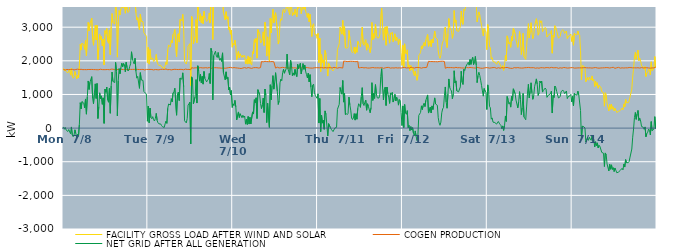
| Category | FACILITY GROSS LOAD AFTER WIND AND SOLAR | COGEN PRODUCTION | NET GRID AFTER ALL GENERATION |
|---|---|---|---|
|  Mon  7/8 | 1779 | 1744 | 35 |
|  Mon  7/8 | 1704 | 1739 | -35 |
|  Mon  7/8 | 1746 | 1725 | 21 |
|  Mon  7/8 | 1680 | 1735 | -55 |
|  Mon  7/8 | 1701 | 1744 | -43 |
|  Mon  7/8 | 1641 | 1742 | -101 |
|  Mon  7/8 | 1695 | 1737 | -42 |
|  Mon  7/8 | 1744 | 1760 | -16 |
|  Mon  7/8 | 1575 | 1742 | -167 |
|  Mon  7/8 | 1783 | 1749 | 34 |
|  Mon  7/8 | 1544 | 1747 | -203 |
|  Mon  7/8 | 1484 | 1739 | -255 |
|  Mon  7/8 | 1523 | 1730 | -207 |
|  Mon  7/8 | 1684 | 1734 | -50 |
|  Mon  7/8 | 1579 | 1742 | -163 |
|  Mon  7/8 | 1465 | 1742 | -277 |
|  Mon  7/8 | 1567 | 1752 | -185 |
|  Mon  7/8 | 1490 | 1734 | -244 |
|  Mon  7/8 | 1843 | 1742 | 101 |
|  Mon  7/8 | 2488 | 1733 | 755 |
|  Mon  7/8 | 2319 | 1748 | 571 |
|  Mon  7/8 | 2528 | 1740 | 788 |
|  Mon  7/8 | 2536 | 1737 | 799 |
|  Mon  7/8 | 2483 | 1741 | 742 |
|  Mon  7/8 | 2338 | 1739 | 599 |
|  Mon  7/8 | 2602 | 1736 | 866 |
|  Mon  7/8 | 2151 | 1737 | 414 |
|  Mon  7/8 | 2676 | 1745 | 931 |
|  Mon  7/8 | 3143 | 1742 | 1401 |
|  Mon  7/8 | 2890 | 1742 | 1148 |
|  Mon  7/8 | 3107 | 1742 | 1365 |
|  Mon  7/8 | 3119 | 1745 | 1374 |
|  Mon  7/8 | 3273 | 1744 | 1529 |
|  Mon  7/8 | 2642 | 1749 | 893 |
|  Mon  7/8 | 2463 | 1740 | 723 |
|  Mon  7/8 | 2777 | 1738 | 1039 |
|  Mon  7/8 | 3053 | 1738 | 1315 |
|  Mon  7/8 | 2619 | 1738 | 881 |
|  Mon  7/8 | 3061 | 1734 | 1327 |
|  Mon  7/8 | 2040 | 1754 | 286 |
|  Mon  7/8 | 2371 | 1735 | 636 |
|  Mon  7/8 | 2790 | 1741 | 1049 |
|  Mon  7/8 | 2626 | 1750 | 876 |
|  Mon  7/8 | 2720 | 1763 | 957 |
|  Mon  7/8 | 2446 | 1739 | 707 |
|  Mon  7/8 | 2644 | 1746 | 898 |
|  Mon  7/8 | 1877 | 1737 | 140 |
|  Mon  7/8 | 2898 | 1738 | 1160 |
|  Mon  7/8 | 2804 | 1738 | 1066 |
|  Mon  7/8 | 2962 | 1743 | 1219 |
|  Mon  7/8 | 2581 | 1741 | 840 |
|  Mon  7/8 | 2522 | 1753 | 769 |
|  Mon  7/8 | 2916 | 1735 | 1181 |
|  Mon  7/8 | 2185 | 1744 | 441 |
|  Mon  7/8 | 3006 | 1752 | 1254 |
|  Mon  7/8 | 3406 | 1740 | 1666 |
|  Mon  7/8 | 3139 | 1751 | 1388 |
|  Mon  7/8 | 3151 | 1747 | 1404 |
|  Mon  7/8 | 3092 | 1739 | 1353 |
|  Mon  7/8 | 3686 | 1733 | 1953 |
|  Mon  7/8 | 3431 | 1744 | 1687 |
|  Mon  7/8 | 2109 | 1746 | 363 |
|  Mon  7/8 | 3145 | 1739 | 1406 |
|  Mon  7/8 | 3496 | 1727 | 1769 |
|  Mon  7/8 | 3362 | 1745 | 1617 |
|  Mon  7/8 | 3542 | 1744 | 1798 |
|  Mon  7/8 | 3671 | 1743 | 1928 |
|  Mon  7/8 | 3567 | 1742 | 1825 |
|  Mon  7/8 | 3660 | 1739 | 1921 |
|  Mon  7/8 | 3629 | 1741 | 1888 |
|  Mon  7/8 | 3415 | 1742 | 1673 |
|  Mon  7/8 | 3703 | 1746 | 1957 |
|  Mon  7/8 | 3536 | 1738 | 1798 |
|  Mon  7/8 | 3436 | 1739 | 1697 |
|  Mon  7/8 | 3467 | 1740 | 1727 |
|  Mon  7/8 | 3587 | 1751 | 1836 |
|  Mon  7/8 | 3656 | 1745 | 1911 |
|  Mon  7/8 | 4012 | 1743 | 2269 |
|  Mon  7/8 | 3803 | 1745 | 2058 |
|  Mon  7/8 | 3716 | 1739 | 1977 |
|  Mon  7/8 | 3655 | 1746 | 1909 |
|  Mon  7/8 | 3821 | 1744 | 2077 |
|  Mon  7/8 | 3432 | 1744 | 1688 |
|  Mon  7/8 | 3213 | 1729 | 1484 |
|  Mon  7/8 | 3283 | 1745 | 1538 |
|  Mon  7/8 | 3303 | 1737 | 1566 |
|  Mon  7/8 | 2923 | 1741 | 1182 |
|  Mon  7/8 | 3392 | 1744 | 1648 |
|  Mon  7/8 | 3176 | 1744 | 1432 |
|  Mon  7/8 | 3180 | 1748 | 1432 |
|  Mon  7/8 | 3164 | 1745 | 1419 |
|  Mon  7/8 | 2836 | 1748 | 1088 |
|  Mon  7/8 | 2798 | 1728 | 1070 |
|  Mon  7/8 | 2778 | 1743 | 1035 |
|  Mon  7/8 | 2730 | 1745 | 985 |
|  Mon  7/8 | 1947 | 1743 | 204 |
|  Tue  7/9 | 2399 | 1743 | 656 |
|  Tue  7/9 | 1902 | 1744 | 158 |
|  Tue  7/9 | 2338 | 1744 | 594 |
|  Tue  7/9 | 2044 | 1736 | 308 |
|  Tue  7/9 | 2019 | 1742 | 277 |
|  Tue  7/9 | 2079 | 1739 | 340 |
|  Tue  7/9 | 1978 | 1729 | 249 |
|  Tue  7/9 | 1954 | 1743 | 211 |
|  Tue  7/9 | 2030 | 1741 | 289 |
|  Tue  7/9 | 2190 | 1753 | 437 |
|  Tue  7/9 | 1962 | 1736 | 226 |
|  Tue  7/9 | 1895 | 1738 | 157 |
|  Tue  7/9 | 1859 | 1732 | 127 |
|  Tue  7/9 | 1866 | 1742 | 124 |
|  Tue  7/9 | 1869 | 1746 | 123 |
|  Tue  7/9 | 1814 | 1740 | 74 |
|  Tue  7/9 | 1791 | 1749 | 42 |
|  Tue  7/9 | 1794 | 1739 | 55 |
|  Tue  7/9 | 1761 | 1743 | 18 |
|  Tue  7/9 | 1861 | 1737 | 124 |
|  Tue  7/9 | 1967 | 1757 | 210 |
|  Tue  7/9 | 1892 | 1753 | 139 |
|  Tue  7/9 | 2324 | 1735 | 589 |
|  Tue  7/9 | 2473 | 1756 | 717 |
|  Tue  7/9 | 2473 | 1741 | 732 |
|  Tue  7/9 | 2409 | 1723 | 686 |
|  Tue  7/9 | 2606 | 1730 | 876 |
|  Tue  7/9 | 2529 | 1746 | 783 |
|  Tue  7/9 | 2784 | 1741 | 1043 |
|  Tue  7/9 | 2823 | 1742 | 1081 |
|  Tue  7/9 | 2932 | 1748 | 1184 |
|  Tue  7/9 | 2910 | 1739 | 1171 |
|  Tue  7/9 | 2126 | 1743 | 383 |
|  Tue  7/9 | 2759 | 1748 | 1011 |
|  Tue  7/9 | 2812 | 1740 | 1072 |
|  Tue  7/9 | 2558 | 1739 | 819 |
|  Tue  7/9 | 3235 | 1746 | 1489 |
|  Tue  7/9 | 3255 | 1738 | 1517 |
|  Tue  7/9 | 3196 | 1743 | 1453 |
|  Tue  7/9 | 3382 | 1739 | 1643 |
|  Tue  7/9 | 2959 | 1733 | 1226 |
|  Tue  7/9 | 1974 | 1756 | 218 |
|  Tue  7/9 | 1994 | 1754 | 240 |
|  Tue  7/9 | 1904 | 1749 | 155 |
|  Tue  7/9 | 2025 | 1743 | 282 |
|  Tue  7/9 | 2434 | 1749 | 685 |
|  Tue  7/9 | 2466 | 1745 | 721 |
|  Tue  7/9 | 2511 | 1740 | 771 |
|  Tue  7/9 | 1263 | 1734 | -471 |
|  Tue  7/9 | 3320 | 1797 | 1523 |
|  Tue  7/9 | 3258 | 1793 | 1465 |
|  Tue  7/9 | 2503 | 1784 | 719 |
|  Tue  7/9 | 2497 | 1802 | 695 |
|  Tue  7/9 | 2727 | 1792 | 935 |
|  Tue  7/9 | 3228 | 1787 | 1441 |
|  Tue  7/9 | 2537 | 1792 | 745 |
|  Tue  7/9 | 3656 | 1803 | 1853 |
|  Tue  7/9 | 3480 | 1786 | 1694 |
|  Tue  7/9 | 3186 | 1791 | 1395 |
|  Tue  7/9 | 3398 | 1798 | 1600 |
|  Tue  7/9 | 3131 | 1784 | 1347 |
|  Tue  7/9 | 3328 | 1790 | 1538 |
|  Tue  7/9 | 3103 | 1796 | 1307 |
|  Tue  7/9 | 3473 | 1789 | 1684 |
|  Tue  7/9 | 3277 | 1805 | 1472 |
|  Tue  7/9 | 3284 | 1796 | 1488 |
|  Tue  7/9 | 3171 | 1797 | 1374 |
|  Tue  7/9 | 3210 | 1787 | 1423 |
|  Tue  7/9 | 3246 | 1791 | 1455 |
|  Tue  7/9 | 3423 | 1800 | 1623 |
|  Tue  7/9 | 3122 | 1798 | 1324 |
|  Tue  7/9 | 4143 | 1773 | 2370 |
|  Tue  7/9 | 4055 | 1800 | 2255 |
|  Tue  7/9 | 2632 | 1794 | 838 |
|  Tue  7/9 | 3956 | 1801 | 2155 |
|  Tue  7/9 | 3959 | 1795 | 2164 |
|  Tue  7/9 | 4084 | 1798 | 2286 |
|  Tue  7/9 | 3931 | 1794 | 2137 |
|  Tue  7/9 | 3903 | 1804 | 2099 |
|  Tue  7/9 | 4037 | 1789 | 2248 |
|  Tue  7/9 | 3873 | 1783 | 2090 |
|  Tue  7/9 | 3801 | 1787 | 2014 |
|  Tue  7/9 | 3883 | 1809 | 2074 |
|  Tue  7/9 | 3760 | 1781 | 1979 |
|  Tue  7/9 | 4023 | 1786 | 2237 |
|  Tue  7/9 | 3431 | 1785 | 1646 |
|  Tue  7/9 | 3426 | 1799 | 1627 |
|  Tue  7/9 | 3215 | 1780 | 1435 |
|  Tue  7/9 | 3461 | 1788 | 1673 |
|  Tue  7/9 | 3244 | 1787 | 1457 |
|  Tue  7/9 | 3310 | 1799 | 1511 |
|  Tue  7/9 | 2934 | 1798 | 1136 |
|  Tue  7/9 | 3007 | 1798 | 1209 |
|  Tue  7/9 | 2791 | 1805 | 986 |
|  Tue  7/9 | 2915 | 1801 | 1114 |
|  Tue  7/9 | 2405 | 1790 | 615 |
|  Wed  7/10 | 2515 | 1795 | 720 |
|  Wed  7/10 | 2470 | 1799 | 671 |
|  Wed  7/10 | 2615 | 1790 | 825 |
|  Wed  7/10 | 2422 | 1791 | 631 |
|  Wed  7/10 | 2036 | 1794 | 242 |
|  Wed  7/10 | 2047 | 1786 | 261 |
|  Wed  7/10 | 2283 | 1803 | 480 |
|  Wed  7/10 | 2093 | 1779 | 314 |
|  Wed  7/10 | 2207 | 1781 | 426 |
|  Wed  7/10 | 2190 | 1772 | 418 |
|  Wed  7/10 | 2096 | 1789 | 307 |
|  Wed  7/10 | 2169 | 1786 | 383 |
|  Wed  7/10 | 2115 | 1796 | 319 |
|  Wed  7/10 | 2158 | 1799 | 359 |
|  Wed  7/10 | 1917 | 1800 | 117 |
|  Wed  7/10 | 2043 | 1781 | 262 |
|  Wed  7/10 | 1902 | 1795 | 107 |
|  Wed  7/10 | 2145 | 1800 | 345 |
|  Wed  7/10 | 1914 | 1794 | 120 |
|  Wed  7/10 | 2108 | 1787 | 321 |
|  Wed  7/10 | 1910 | 1787 | 123 |
|  Wed  7/10 | 1873 | 1776 | 97 |
|  Wed  7/10 | 2271 | 1789 | 482 |
|  Wed  7/10 | 2212 | 1795 | 417 |
|  Wed  7/10 | 2633 | 1789 | 844 |
|  Wed  7/10 | 2552 | 1798 | 754 |
|  Wed  7/10 | 2675 | 1774 | 901 |
|  Wed  7/10 | 2080 | 1796 | 284 |
|  Wed  7/10 | 2929 | 1787 | 1142 |
|  Wed  7/10 | 2918 | 1784 | 1134 |
|  Wed  7/10 | 2788 | 1797 | 991 |
|  Wed  7/10 | 2528 | 1799 | 729 |
|  Wed  7/10 | 2558 | 1979 | 579 |
|  Wed  7/10 | 2664 | 1977 | 687 |
|  Wed  7/10 | 2861 | 1969 | 892 |
|  Wed  7/10 | 2455 | 1992 | 463 |
|  Wed  7/10 | 3148 | 1986 | 1162 |
|  Wed  7/10 | 2963 | 1982 | 981 |
|  Wed  7/10 | 2140 | 1977 | 163 |
|  Wed  7/10 | 2712 | 1974 | 738 |
|  Wed  7/10 | 2728 | 1975 | 753 |
|  Wed  7/10 | 2004 | 1983 | 21 |
|  Wed  7/10 | 3264 | 1975 | 1289 |
|  Wed  7/10 | 2830 | 1987 | 843 |
|  Wed  7/10 | 3243 | 1978 | 1265 |
|  Wed  7/10 | 3534 | 1974 | 1560 |
|  Wed  7/10 | 3130 | 1972 | 1158 |
|  Wed  7/10 | 3332 | 1973 | 1359 |
|  Wed  7/10 | 3430 | 1783 | 1647 |
|  Wed  7/10 | 3448 | 1809 | 1639 |
|  Wed  7/10 | 2895 | 1810 | 1085 |
|  Wed  7/10 | 2498 | 1795 | 703 |
|  Wed  7/10 | 2599 | 1788 | 811 |
|  Wed  7/10 | 3137 | 1792 | 1345 |
|  Wed  7/10 | 3251 | 1794 | 1457 |
|  Wed  7/10 | 3206 | 1799 | 1407 |
|  Wed  7/10 | 3462 | 1806 | 1656 |
|  Wed  7/10 | 3536 | 1789 | 1747 |
|  Wed  7/10 | 3425 | 1795 | 1630 |
|  Wed  7/10 | 3404 | 1788 | 1616 |
|  Wed  7/10 | 3564 | 1795 | 1769 |
|  Wed  7/10 | 3991 | 1792 | 2199 |
|  Wed  7/10 | 3547 | 1784 | 1763 |
|  Wed  7/10 | 3457 | 1787 | 1670 |
|  Wed  7/10 | 3369 | 1785 | 1584 |
|  Wed  7/10 | 3807 | 1793 | 2014 |
|  Wed  7/10 | 3657 | 1798 | 1859 |
|  Wed  7/10 | 3343 | 1785 | 1558 |
|  Wed  7/10 | 3431 | 1790 | 1641 |
|  Wed  7/10 | 3366 | 1796 | 1570 |
|  Wed  7/10 | 3537 | 1792 | 1745 |
|  Wed  7/10 | 3404 | 1802 | 1602 |
|  Wed  7/10 | 3310 | 1781 | 1529 |
|  Wed  7/10 | 3697 | 1803 | 1894 |
|  Wed  7/10 | 3561 | 1794 | 1767 |
|  Wed  7/10 | 3659 | 1793 | 1866 |
|  Wed  7/10 | 3712 | 1785 | 1927 |
|  Wed  7/10 | 3403 | 1793 | 1610 |
|  Wed  7/10 | 3557 | 1790 | 1767 |
|  Wed  7/10 | 3699 | 1782 | 1917 |
|  Wed  7/10 | 3534 | 1786 | 1748 |
|  Wed  7/10 | 3677 | 1807 | 1870 |
|  Wed  7/10 | 3486 | 1799 | 1687 |
|  Wed  7/10 | 3374 | 1786 | 1588 |
|  Wed  7/10 | 3288 | 1798 | 1490 |
|  Wed  7/10 | 3413 | 1781 | 1632 |
|  Wed  7/10 | 3162 | 1788 | 1374 |
|  Wed  7/10 | 3383 | 1794 | 1589 |
|  Wed  7/10 | 2996 | 1784 | 1212 |
|  Wed  7/10 | 2722 | 1790 | 932 |
|  Wed  7/10 | 3056 | 1783 | 1273 |
|  Wed  7/10 | 3104 | 1797 | 1307 |
|  Wed  7/10 | 2842 | 1794 | 1048 |
|  Wed  7/10 | 2762 | 1793 | 969 |
|  Wed  7/10 | 2792 | 1796 | 996 |
|  Wed  7/10 | 2668 | 1784 | 884 |
|  Thu  7/11 | 2814 | 1795 | 1019 |
|  Thu  7/11 | 1948 | 1798 | 150 |
|  Thu  7/11 | 2674 | 1793 | 881 |
|  Thu  7/11 | 1680 | 1786 | -106 |
|  Thu  7/11 | 2182 | 1799 | 383 |
|  Thu  7/11 | 1950 | 1802 | 148 |
|  Thu  7/11 | 2027 | 1789 | 238 |
|  Thu  7/11 | 1761 | 1797 | -36 |
|  Thu  7/11 | 2308 | 1797 | 511 |
|  Thu  7/11 | 2204 | 1797 | 407 |
|  Thu  7/11 | 2177 | 1789 | 388 |
|  Thu  7/11 | 1547 | 1783 | -236 |
|  Thu  7/11 | 1926 | 1794 | 132 |
|  Thu  7/11 | 1942 | 1793 | 149 |
|  Thu  7/11 | 1808 | 1796 | 12 |
|  Thu  7/11 | 1752 | 1788 | -36 |
|  Thu  7/11 | 1735 | 1787 | -52 |
|  Thu  7/11 | 1700 | 1805 | -105 |
|  Thu  7/11 | 1719 | 1806 | -87 |
|  Thu  7/11 | 1793 | 1794 | -1 |
|  Thu  7/11 | 1818 | 1796 | 22 |
|  Thu  7/11 | 1815 | 1792 | 23 |
|  Thu  7/11 | 2342 | 1782 | 560 |
|  Thu  7/11 | 2352 | 1794 | 558 |
|  Thu  7/11 | 2505 | 1799 | 706 |
|  Thu  7/11 | 3000 | 1794 | 1206 |
|  Thu  7/11 | 2881 | 1795 | 1086 |
|  Thu  7/11 | 2792 | 1786 | 1006 |
|  Thu  7/11 | 3199 | 1785 | 1414 |
|  Thu  7/11 | 2762 | 1990 | 772 |
|  Thu  7/11 | 3015 | 1986 | 1029 |
|  Thu  7/11 | 2387 | 1986 | 401 |
|  Thu  7/11 | 2407 | 1976 | 431 |
|  Thu  7/11 | 2377 | 1977 | 400 |
|  Thu  7/11 | 2410 | 1972 | 438 |
|  Thu  7/11 | 2902 | 1981 | 921 |
|  Thu  7/11 | 2669 | 1977 | 692 |
|  Thu  7/11 | 2519 | 1986 | 533 |
|  Thu  7/11 | 2277 | 1977 | 300 |
|  Thu  7/11 | 2239 | 1983 | 256 |
|  Thu  7/11 | 2280 | 1979 | 301 |
|  Thu  7/11 | 2410 | 1979 | 431 |
|  Thu  7/11 | 2218 | 1981 | 237 |
|  Thu  7/11 | 2400 | 1973 | 427 |
|  Thu  7/11 | 2254 | 1990 | 264 |
|  Thu  7/11 | 2577 | 1986 | 591 |
|  Thu  7/11 | 2510 | 1786 | 724 |
|  Thu  7/11 | 2461 | 1783 | 678 |
|  Thu  7/11 | 2415 | 1798 | 617 |
|  Thu  7/11 | 2727 | 1791 | 936 |
|  Thu  7/11 | 3004 | 1802 | 1202 |
|  Thu  7/11 | 2510 | 1788 | 722 |
|  Thu  7/11 | 2460 | 1790 | 670 |
|  Thu  7/11 | 2558 | 1790 | 768 |
|  Thu  7/11 | 2629 | 1796 | 833 |
|  Thu  7/11 | 2317 | 1786 | 531 |
|  Thu  7/11 | 2509 | 1786 | 723 |
|  Thu  7/11 | 2439 | 1797 | 642 |
|  Thu  7/11 | 2445 | 1785 | 660 |
|  Thu  7/11 | 2242 | 1786 | 456 |
|  Thu  7/11 | 2402 | 1792 | 610 |
|  Thu  7/11 | 3142 | 1792 | 1350 |
|  Thu  7/11 | 2624 | 1801 | 823 |
|  Thu  7/11 | 2807 | 1773 | 1034 |
|  Thu  7/11 | 2674 | 1791 | 883 |
|  Thu  7/11 | 3086 | 1794 | 1292 |
|  Thu  7/11 | 2813 | 1791 | 1022 |
|  Thu  7/11 | 2683 | 1785 | 898 |
|  Thu  7/11 | 2697 | 1792 | 905 |
|  Thu  7/11 | 2686 | 1792 | 894 |
|  Thu  7/11 | 2796 | 1787 | 1009 |
|  Thu  7/11 | 3329 | 1794 | 1535 |
|  Thu  7/11 | 3566 | 1800 | 1766 |
|  Thu  7/11 | 3021 | 1799 | 1222 |
|  Thu  7/11 | 2615 | 1776 | 839 |
|  Thu  7/11 | 2929 | 1780 | 1149 |
|  Thu  7/11 | 3010 | 1791 | 1219 |
|  Thu  7/11 | 2462 | 1791 | 671 |
|  Thu  7/11 | 3022 | 1802 | 1220 |
|  Thu  7/11 | 2817 | 1797 | 1020 |
|  Thu  7/11 | 2725 | 1803 | 922 |
|  Thu  7/11 | 2526 | 1792 | 734 |
|  Thu  7/11 | 2829 | 1783 | 1046 |
|  Thu  7/11 | 2792 | 1794 | 998 |
|  Thu  7/11 | 2851 | 1791 | 1060 |
|  Thu  7/11 | 2570 | 1796 | 774 |
|  Thu  7/11 | 2640 | 1786 | 854 |
|  Thu  7/11 | 2803 | 1798 | 1005 |
|  Thu  7/11 | 2601 | 1795 | 806 |
|  Thu  7/11 | 2706 | 1790 | 916 |
|  Thu  7/11 | 2664 | 1787 | 877 |
|  Thu  7/11 | 2479 | 1797 | 682 |
|  Thu  7/11 | 2640 | 1791 | 849 |
|  Thu  7/11 | 2610 | 1796 | 814 |
|  Thu  7/11 | 2250 | 1785 | 465 |
|  Thu  7/11 | 1864 | 1789 | 75 |
|  Fri  7/12 | 2457 | 1798 | 659 |
|  Fri  7/12 | 1803 | 1788 | 15 |
|  Fri  7/12 | 2505 | 1803 | 702 |
|  Fri  7/12 | 2230 | 1785 | 445 |
|  Fri  7/12 | 2198 | 1788 | 410 |
|  Fri  7/12 | 2327 | 1807 | 520 |
|  Fri  7/12 | 1806 | 1792 | 14 |
|  Fri  7/12 | 1875 | 1794 | 81 |
|  Fri  7/12 | 1705 | 1782 | -77 |
|  Fri  7/12 | 1857 | 1814 | 43 |
|  Fri  7/12 | 1730 | 1788 | -58 |
|  Fri  7/12 | 1810 | 1795 | 15 |
|  Fri  7/12 | 1636 | 1793 | -157 |
|  Fri  7/12 | 1557 | 1786 | -229 |
|  Fri  7/12 | 1690 | 1774 | -84 |
|  Fri  7/12 | 1555 | 1801 | -246 |
|  Fri  7/12 | 1420 | 1787 | -367 |
|  Fri  7/12 | 1585 | 1802 | -217 |
|  Fri  7/12 | 2165 | 1787 | 378 |
|  Fri  7/12 | 2196 | 1797 | 399 |
|  Fri  7/12 | 2246 | 1782 | 464 |
|  Fri  7/12 | 2443 | 1782 | 661 |
|  Fri  7/12 | 2351 | 1800 | 551 |
|  Fri  7/12 | 2472 | 1798 | 674 |
|  Fri  7/12 | 2549 | 1808 | 741 |
|  Fri  7/12 | 2437 | 1799 | 638 |
|  Fri  7/12 | 2617 | 1790 | 827 |
|  Fri  7/12 | 2621 | 1804 | 817 |
|  Fri  7/12 | 2782 | 1796 | 986 |
|  Fri  7/12 | 2432 | 1985 | 447 |
|  Fri  7/12 | 2447 | 1989 | 458 |
|  Fri  7/12 | 2599 | 1978 | 621 |
|  Fri  7/12 | 2422 | 1971 | 451 |
|  Fri  7/12 | 2638 | 1978 | 660 |
|  Fri  7/12 | 2532 | 1980 | 552 |
|  Fri  7/12 | 2708 | 1975 | 733 |
|  Fri  7/12 | 2884 | 1986 | 898 |
|  Fri  7/12 | 2692 | 1975 | 717 |
|  Fri  7/12 | 2674 | 1974 | 700 |
|  Fri  7/12 | 2647 | 1971 | 676 |
|  Fri  7/12 | 2292 | 1983 | 309 |
|  Fri  7/12 | 2137 | 1980 | 157 |
|  Fri  7/12 | 2072 | 1989 | 83 |
|  Fri  7/12 | 2164 | 1986 | 178 |
|  Fri  7/12 | 2431 | 1977 | 454 |
|  Fri  7/12 | 2557 | 1987 | 570 |
|  Fri  7/12 | 2599 | 1984 | 615 |
|  Fri  7/12 | 2939 | 1980 | 959 |
|  Fri  7/12 | 3002 | 1779 | 1223 |
|  Fri  7/12 | 2565 | 1792 | 773 |
|  Fri  7/12 | 2393 | 1803 | 590 |
|  Fri  7/12 | 2810 | 1788 | 1022 |
|  Fri  7/12 | 3258 | 1797 | 1461 |
|  Fri  7/12 | 3002 | 1795 | 1207 |
|  Fri  7/12 | 2944 | 1799 | 1145 |
|  Fri  7/12 | 2890 | 1787 | 1103 |
|  Fri  7/12 | 2668 | 1797 | 871 |
|  Fri  7/12 | 2809 | 1800 | 1009 |
|  Fri  7/12 | 3494 | 1789 | 1705 |
|  Fri  7/12 | 3138 | 1798 | 1340 |
|  Fri  7/12 | 3209 | 1806 | 1403 |
|  Fri  7/12 | 2897 | 1789 | 1108 |
|  Fri  7/12 | 2894 | 1793 | 1101 |
|  Fri  7/12 | 2873 | 1795 | 1078 |
|  Fri  7/12 | 2865 | 1797 | 1068 |
|  Fri  7/12 | 3015 | 1791 | 1224 |
|  Fri  7/12 | 3478 | 1789 | 1689 |
|  Fri  7/12 | 3143 | 1780 | 1363 |
|  Fri  7/12 | 3084 | 1787 | 1297 |
|  Fri  7/12 | 3531 | 1783 | 1748 |
|  Fri  7/12 | 3494 | 1785 | 1709 |
|  Fri  7/12 | 3604 | 1787 | 1817 |
|  Fri  7/12 | 3612 | 1800 | 1812 |
|  Fri  7/12 | 3705 | 1789 | 1916 |
|  Fri  7/12 | 3750 | 1793 | 1957 |
|  Fri  7/12 | 3650 | 1778 | 1872 |
|  Fri  7/12 | 3841 | 1802 | 2039 |
|  Fri  7/12 | 3696 | 1803 | 1893 |
|  Fri  7/12 | 3830 | 1796 | 2034 |
|  Fri  7/12 | 3893 | 1789 | 2104 |
|  Fri  7/12 | 3680 | 1789 | 1891 |
|  Fri  7/12 | 3768 | 1786 | 1982 |
|  Fri  7/12 | 3915 | 1785 | 2130 |
|  Fri  7/12 | 3676 | 1802 | 1874 |
|  Fri  7/12 | 3156 | 1804 | 1352 |
|  Fri  7/12 | 3344 | 1782 | 1562 |
|  Fri  7/12 | 3454 | 1793 | 1661 |
|  Fri  7/12 | 3359 | 1795 | 1564 |
|  Fri  7/12 | 3204 | 1781 | 1423 |
|  Fri  7/12 | 3049 | 1781 | 1268 |
|  Fri  7/12 | 2882 | 1778 | 1104 |
|  Fri  7/12 | 2743 | 1793 | 950 |
|  Fri  7/12 | 2962 | 1787 | 1175 |
|  Fri  7/12 | 2904 | 1801 | 1103 |
|  Fri  7/12 | 2859 | 1797 | 1062 |
|  Fri  7/12 | 2332 | 1779 | 553 |
|  Sat  7/13 | 3079 | 1795 | 1284 |
|  Sat  7/13 | 2886 | 1788 | 1098 |
|  Sat  7/13 | 2431 | 1783 | 648 |
|  Sat  7/13 | 2391 | 1788 | 603 |
|  Sat  7/13 | 2055 | 1791 | 264 |
|  Sat  7/13 | 2096 | 1793 | 303 |
|  Sat  7/13 | 1975 | 1799 | 176 |
|  Sat  7/13 | 1971 | 1799 | 172 |
|  Sat  7/13 | 1965 | 1800 | 165 |
|  Sat  7/13 | 1935 | 1788 | 147 |
|  Sat  7/13 | 1897 | 1778 | 119 |
|  Sat  7/13 | 1919 | 1785 | 134 |
|  Sat  7/13 | 1993 | 1796 | 197 |
|  Sat  7/13 | 1942 | 1795 | 147 |
|  Sat  7/13 | 1891 | 1781 | 110 |
|  Sat  7/13 | 1870 | 1794 | 76 |
|  Sat  7/13 | 1772 | 1798 | -26 |
|  Sat  7/13 | 1857 | 1792 | 65 |
|  Sat  7/13 | 1718 | 1787 | -69 |
|  Sat  7/13 | 1856 | 1785 | 71 |
|  Sat  7/13 | 2160 | 1799 | 361 |
|  Sat  7/13 | 2003 | 1805 | 198 |
|  Sat  7/13 | 2742 | 1804 | 938 |
|  Sat  7/13 | 2641 | 1792 | 849 |
|  Sat  7/13 | 2500 | 1787 | 713 |
|  Sat  7/13 | 2550 | 1787 | 763 |
|  Sat  7/13 | 2401 | 1778 | 623 |
|  Sat  7/13 | 2734 | 1793 | 941 |
|  Sat  7/13 | 2601 | 1775 | 826 |
|  Sat  7/13 | 2972 | 1804 | 1168 |
|  Sat  7/13 | 2992 | 1798 | 1194 |
|  Sat  7/13 | 2807 | 1785 | 1022 |
|  Sat  7/13 | 2622 | 1790 | 832 |
|  Sat  7/13 | 2610 | 1793 | 817 |
|  Sat  7/13 | 2400 | 1799 | 601 |
|  Sat  7/13 | 2572 | 1793 | 779 |
|  Sat  7/13 | 2872 | 1789 | 1083 |
|  Sat  7/13 | 2627 | 1773 | 854 |
|  Sat  7/13 | 2186 | 1785 | 401 |
|  Sat  7/13 | 2403 | 1795 | 608 |
|  Sat  7/13 | 2817 | 1786 | 1031 |
|  Sat  7/13 | 2130 | 1797 | 333 |
|  Sat  7/13 | 2081 | 1795 | 286 |
|  Sat  7/13 | 2041 | 1793 | 248 |
|  Sat  7/13 | 2425 | 1797 | 628 |
|  Sat  7/13 | 2819 | 1779 | 1040 |
|  Sat  7/13 | 3104 | 1803 | 1301 |
|  Sat  7/13 | 2679 | 1781 | 898 |
|  Sat  7/13 | 2892 | 1795 | 1097 |
|  Sat  7/13 | 3133 | 1786 | 1347 |
|  Sat  7/13 | 2843 | 1795 | 1048 |
|  Sat  7/13 | 2659 | 1803 | 856 |
|  Sat  7/13 | 2753 | 1796 | 957 |
|  Sat  7/13 | 3024 | 1795 | 1229 |
|  Sat  7/13 | 3004 | 1780 | 1224 |
|  Sat  7/13 | 3253 | 1790 | 1463 |
|  Sat  7/13 | 3093 | 1790 | 1303 |
|  Sat  7/13 | 2762 | 1792 | 970 |
|  Sat  7/13 | 2823 | 1781 | 1042 |
|  Sat  7/13 | 3197 | 1798 | 1399 |
|  Sat  7/13 | 3137 | 1796 | 1341 |
|  Sat  7/13 | 3189 | 1790 | 1399 |
|  Sat  7/13 | 2865 | 1795 | 1070 |
|  Sat  7/13 | 2904 | 1784 | 1120 |
|  Sat  7/13 | 2878 | 1787 | 1091 |
|  Sat  7/13 | 2993 | 1803 | 1190 |
|  Sat  7/13 | 2955 | 1798 | 1157 |
|  Sat  7/13 | 2705 | 1791 | 914 |
|  Sat  7/13 | 2713 | 1798 | 915 |
|  Sat  7/13 | 2783 | 1790 | 993 |
|  Sat  7/13 | 2805 | 1789 | 1016 |
|  Sat  7/13 | 2814 | 1796 | 1018 |
|  Sat  7/13 | 2902 | 1805 | 1097 |
|  Sat  7/13 | 2227 | 1779 | 448 |
|  Sat  7/13 | 2762 | 1793 | 969 |
|  Sat  7/13 | 2702 | 1792 | 910 |
|  Sat  7/13 | 3044 | 1794 | 1250 |
|  Sat  7/13 | 2994 | 1787 | 1207 |
|  Sat  7/13 | 2889 | 1797 | 1092 |
|  Sat  7/13 | 2865 | 1795 | 1070 |
|  Sat  7/13 | 2673 | 1778 | 895 |
|  Sat  7/13 | 2674 | 1797 | 877 |
|  Sat  7/13 | 2729 | 1793 | 936 |
|  Sat  7/13 | 2874 | 1790 | 1084 |
|  Sat  7/13 | 2873 | 1783 | 1090 |
|  Sat  7/13 | 2925 | 1797 | 1128 |
|  Sat  7/13 | 2894 | 1802 | 1092 |
|  Sat  7/13 | 2815 | 1792 | 1023 |
|  Sat  7/13 | 2830 | 1795 | 1035 |
|  Sat  7/13 | 2887 | 1784 | 1103 |
|  Sat  7/13 | 2661 | 1785 | 876 |
|  Sat  7/13 | 2725 | 1792 | 933 |
|  Sat  7/13 | 2730 | 1788 | 942 |
|  Sat  7/13 | 2751 | 1789 | 962 |
|  Sat  7/13 | 2795 | 1795 | 1000 |
|  Sat  7/13 | 2576 | 1796 | 780 |
|  Sun  7/14 | 2743 | 1798 | 945 |
|  Sun  7/14 | 2464 | 1804 | 660 |
|  Sun  7/14 | 2818 | 1784 | 1034 |
|  Sun  7/14 | 2785 | 1784 | 1001 |
|  Sun  7/14 | 2801 | 1786 | 1015 |
|  Sun  7/14 | 2765 | 1785 | 980 |
|  Sun  7/14 | 2887 | 1790 | 1097 |
|  Sun  7/14 | 2783 | 1796 | 987 |
|  Sun  7/14 | 2753 | 1791 | 962 |
|  Sun  7/14 | 2305 | 1784 | 521 |
|  Sun  7/14 | 1438 | 1791 | -353 |
|  Sun  7/14 | 1855 | 1797 | 58 |
|  Sun  7/14 | 1866 | 1793 | 73 |
|  Sun  7/14 | 1838 | 1804 | 34 |
|  Sun  7/14 | 1798 | 1798 | 0 |
|  Sun  7/14 | 1379 | 1795 | -416 |
|  Sun  7/14 | 1384 | 1792 | -408 |
|  Sun  7/14 | 1505 | 1794 | -289 |
|  Sun  7/14 | 1425 | 1789 | -364 |
|  Sun  7/14 | 1511 | 1783 | -272 |
|  Sun  7/14 | 1462 | 1791 | -329 |
|  Sun  7/14 | 1428 | 1791 | -363 |
|  Sun  7/14 | 1551 | 1784 | -233 |
|  Sun  7/14 | 1407 | 1782 | -375 |
|  Sun  7/14 | 1455 | 1793 | -338 |
|  Sun  7/14 | 1233 | 1794 | -561 |
|  Sun  7/14 | 1395 | 1800 | -405 |
|  Sun  7/14 | 1270 | 1792 | -522 |
|  Sun  7/14 | 1349 | 1787 | -438 |
|  Sun  7/14 | 1186 | 1777 | -591 |
|  Sun  7/14 | 1267 | 1782 | -515 |
|  Sun  7/14 | 1238 | 1789 | -551 |
|  Sun  7/14 | 1217 | 1788 | -571 |
|  Sun  7/14 | 1084 | 1806 | -722 |
|  Sun  7/14 | 1085 | 1791 | -706 |
|  Sun  7/14 | 1048 | 1796 | -748 |
|  Sun  7/14 | 651 | 1793 | -1142 |
|  Sun  7/14 | 1051 | 1790 | -739 |
|  Sun  7/14 | 1004 | 1799 | -795 |
|  Sun  7/14 | 736 | 1800 | -1064 |
|  Sun  7/14 | 738 | 1796 | -1058 |
|  Sun  7/14 | 515 | 1788 | -1273 |
|  Sun  7/14 | 707 | 1786 | -1079 |
|  Sun  7/14 | 560 | 1784 | -1224 |
|  Sun  7/14 | 705 | 1798 | -1093 |
|  Sun  7/14 | 562 | 1793 | -1231 |
|  Sun  7/14 | 635 | 1808 | -1173 |
|  Sun  7/14 | 509 | 1802 | -1293 |
|  Sun  7/14 | 590 | 1776 | -1186 |
|  Sun  7/14 | 609 | 1799 | -1190 |
|  Sun  7/14 | 464 | 1793 | -1329 |
|  Sun  7/14 | 485 | 1788 | -1303 |
|  Sun  7/14 | 499 | 1805 | -1306 |
|  Sun  7/14 | 501 | 1790 | -1289 |
|  Sun  7/14 | 525 | 1782 | -1257 |
|  Sun  7/14 | 532 | 1795 | -1263 |
|  Sun  7/14 | 597 | 1792 | -1195 |
|  Sun  7/14 | 542 | 1784 | -1242 |
|  Sun  7/14 | 719 | 1786 | -1067 |
|  Sun  7/14 | 631 | 1789 | -1158 |
|  Sun  7/14 | 855 | 1792 | -937 |
|  Sun  7/14 | 752 | 1780 | -1028 |
|  Sun  7/14 | 766 | 1790 | -1024 |
|  Sun  7/14 | 755 | 1783 | -1028 |
|  Sun  7/14 | 809 | 1800 | -991 |
|  Sun  7/14 | 926 | 1788 | -862 |
|  Sun  7/14 | 916 | 1798 | -882 |
|  Sun  7/14 | 1163 | 1786 | -623 |
|  Sun  7/14 | 1521 | 1791 | -270 |
|  Sun  7/14 | 1772 | 1795 | -23 |
|  Sun  7/14 | 2109 | 1792 | 317 |
|  Sun  7/14 | 2253 | 1789 | 464 |
|  Sun  7/14 | 2050 | 1790 | 260 |
|  Sun  7/14 | 2217 | 1797 | 420 |
|  Sun  7/14 | 2319 | 1794 | 525 |
|  Sun  7/14 | 2005 | 1780 | 225 |
|  Sun  7/14 | 2077 | 1785 | 292 |
|  Sun  7/14 | 1997 | 1786 | 211 |
|  Sun  7/14 | 1847 | 1799 | 48 |
|  Sun  7/14 | 1856 | 1802 | 54 |
|  Sun  7/14 | 1812 | 1788 | 24 |
|  Sun  7/14 | 1749 | 1786 | -37 |
|  Sun  7/14 | 1828 | 1793 | 35 |
|  Sun  7/14 | 1535 | 1792 | -257 |
|  Sun  7/14 | 1631 | 1794 | -163 |
|  Sun  7/14 | 1661 | 1785 | -124 |
|  Sun  7/14 | 1759 | 1787 | -28 |
|  Sun  7/14 | 1725 | 1789 | -64 |
|  Sun  7/14 | 1579 | 1782 | -203 |
|  Sun  7/14 | 1970 | 1777 | 193 |
|  Sun  7/14 | 1710 | 1789 | -79 |
|  Sun  7/14 | 1725 | 1777 | -52 |
|  Sun  7/14 | 1762 | 1790 | -28 |
|  Sun  7/14 | 2127 | 1787 | 340 |
|  Sun  7/14 | 1802 | 1813 | -11 |
|  Sun  7/14 | 1882 | 1785 | 97 |